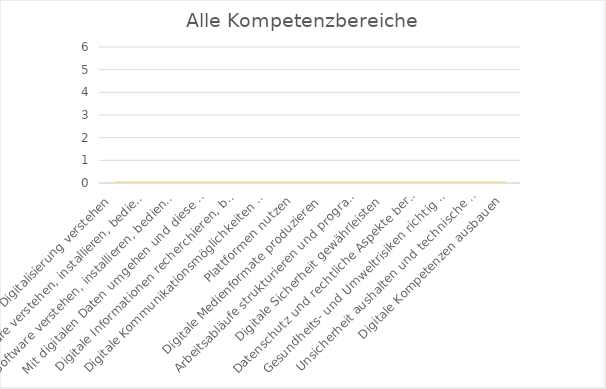
| Category | Series 0 |
|---|---|
| Konzepte der Digitalisierung verstehen | 0 |
| Hardware verstehen, installieren, bedienen | 0 |
| Software verstehen, installieren, bedienen | 0 |
| Mit digitalen Daten umgehen und diese verwalten | 0 |
| Digitale Informationen recherchieren, beurteilen und bewerten | 0 |
| Digitale Kommunikationsmöglichkeiten nutzen | 0 |
| Plattformen nutzen | 0 |
| Digitale Medienformate produzieren | 0 |
| Arbeitsabläufe strukturieren und programmieren | 0 |
| Digitale Sicherheit gewährleisten | 0 |
| Datenschutz und rechtliche Aspekte berücksichtigen | 0 |
| Gesundheits- und Umweltrisiken richtig einschätzen und berücksichtigen | 0 |
| Unsicherheit aushalten und technische Herausforderungen lösen. | 0 |
| Digitale Kompetenzen ausbauen | 0 |